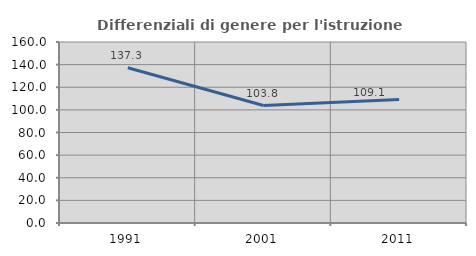
| Category | Differenziali di genere per l'istruzione superiore |
|---|---|
| 1991.0 | 137.292 |
| 2001.0 | 103.843 |
| 2011.0 | 109.084 |